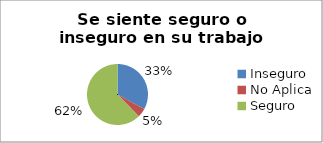
| Category | Series 0 |
|---|---|
| Inseguro | 0.329 |
| No Aplica | 0.047 |
| Seguro  | 0.624 |